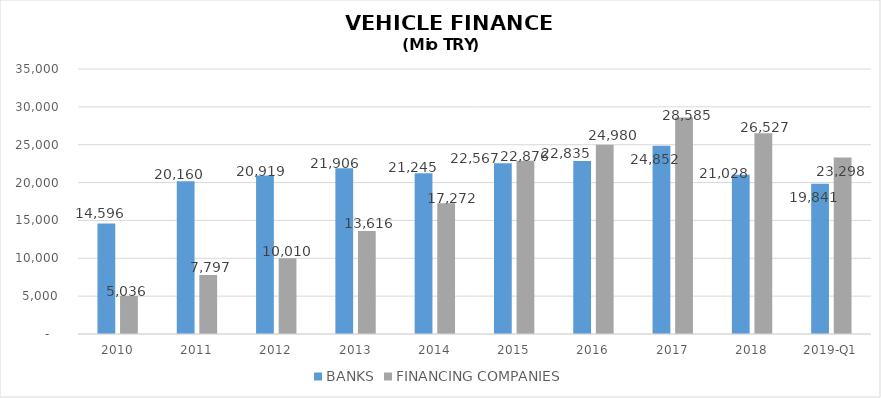
| Category | BANKS | FINANCING COMPANIES |
|---|---|---|
| 2010 | 14596 | 5035.89 |
| 2011 | 20160 | 7796.854 |
| 2012 | 20919 | 10009.755 |
| 2013 | 21906 | 13616.036 |
| 2014 | 21245 | 17271.844 |
| 2015 | 22567 | 22875.563 |
| 2016 | 22835 | 24980.231 |
| 2017 | 24852 | 28584.938 |
| 2018 | 21028 | 26527.133 |
| 2019-Q1 | 19841 | 23298.037 |